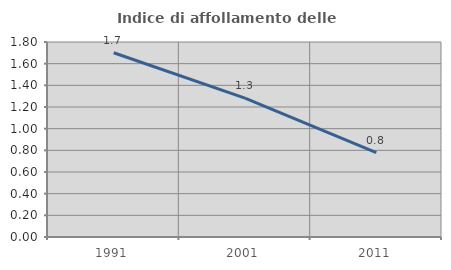
| Category | Indice di affollamento delle abitazioni  |
|---|---|
| 1991.0 | 1.701 |
| 2001.0 | 1.282 |
| 2011.0 | 0.779 |